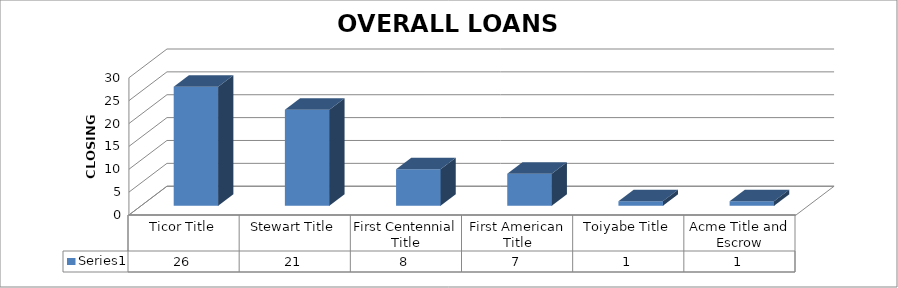
| Category | Series 0 |
|---|---|
| Ticor Title | 26 |
| Stewart Title | 21 |
| First Centennial Title | 8 |
| First American Title | 7 |
| Toiyabe Title | 1 |
| Acme Title and Escrow | 1 |